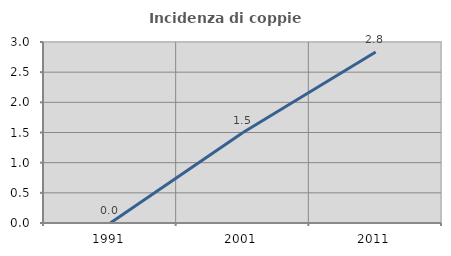
| Category | Incidenza di coppie miste |
|---|---|
| 1991.0 | 0 |
| 2001.0 | 1.5 |
| 2011.0 | 2.835 |